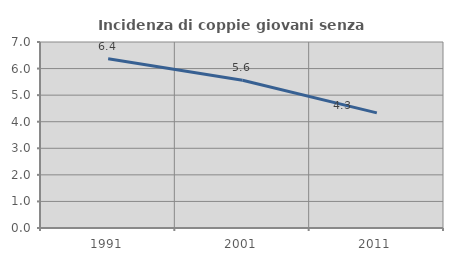
| Category | Incidenza di coppie giovani senza figli |
|---|---|
| 1991.0 | 6.369 |
| 2001.0 | 5.558 |
| 2011.0 | 4.333 |